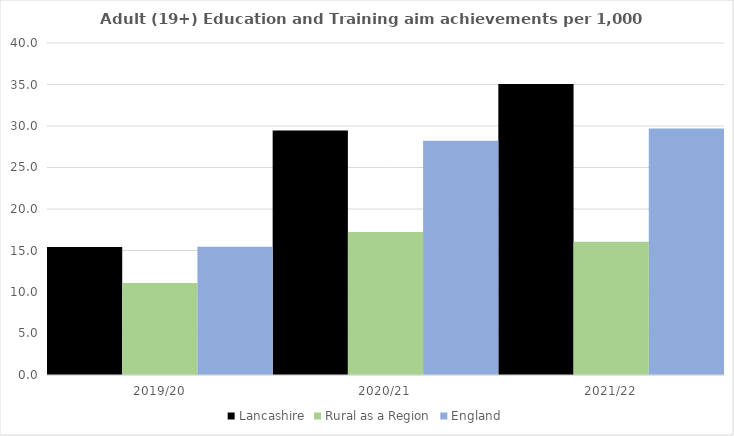
| Category | Lancashire | Rural as a Region | England |
|---|---|---|---|
| 2019/20 | 15.436 | 11.081 | 15.446 |
| 2020/21 | 29.462 | 17.224 | 28.211 |
| 2021/22 | 35.067 | 16.063 | 29.711 |